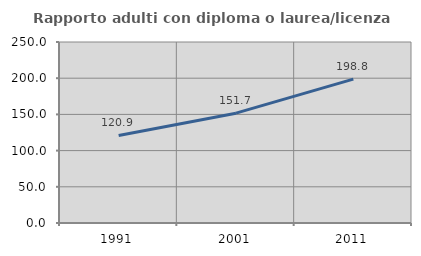
| Category | Rapporto adulti con diploma o laurea/licenza media  |
|---|---|
| 1991.0 | 120.93 |
| 2001.0 | 151.705 |
| 2011.0 | 198.765 |